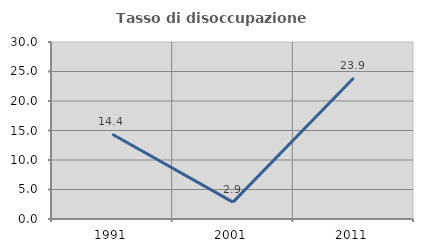
| Category | Tasso di disoccupazione giovanile  |
|---|---|
| 1991.0 | 14.365 |
| 2001.0 | 2.857 |
| 2011.0 | 23.894 |